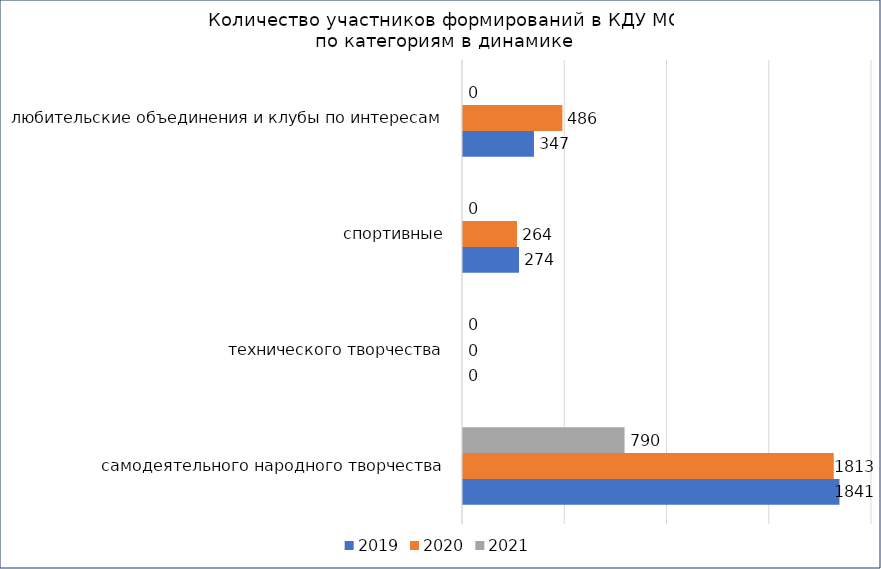
| Category | 2019 | 2020 | 2021 |
|---|---|---|---|
| самодеятельного народного творчества | 1841 | 1813 | 790 |
| технического творчества | 0 | 0 | 0 |
| спортивные | 274 | 264 | 0 |
| любительские объединения и клубы по интересам | 347 | 486 | 0 |